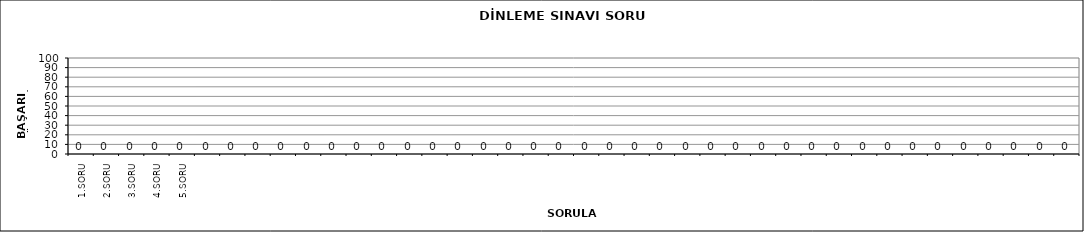
| Category | Series 0 |
|---|---|
| 1.SORU | 0 |
| 2.SORU | 0 |
| 3.SORU | 0 |
| 4.SORU | 0 |
| 5.SORU | 0 |
|   | 0 |
|   | 0 |
|   | 0 |
|   | 0 |
|   | 0 |
|   | 0 |
|   | 0 |
|   | 0 |
|   | 0 |
|   | 0 |
|   | 0 |
|   | 0 |
|   | 0 |
|   | 0 |
|   | 0 |
|   | 0 |
|   | 0 |
|   | 0 |
|   | 0 |
|   | 0 |
|   | 0 |
|   | 0 |
|   | 0 |
|   | 0 |
|   | 0 |
|   | 0 |
|   | 0 |
|   | 0 |
|   | 0 |
|   | 0 |
|   | 0 |
|   | 0 |
|   | 0 |
|   | 0 |
|   | 0 |